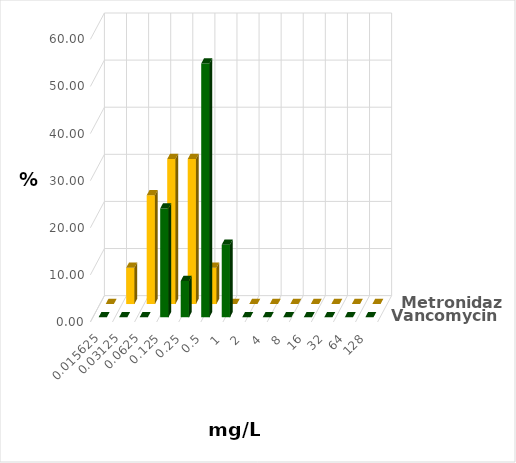
| Category | Vancomycin | Metronidazol |
|---|---|---|
| 0.015625 | 0 | 0 |
| 0.03125 | 0 | 7.692 |
| 0.0625 | 0 | 23.077 |
| 0.125 | 23.077 | 30.769 |
| 0.25 | 7.692 | 30.769 |
| 0.5 | 53.846 | 7.692 |
| 1.0 | 15.385 | 0 |
| 2.0 | 0 | 0 |
| 4.0 | 0 | 0 |
| 8.0 | 0 | 0 |
| 16.0 | 0 | 0 |
| 32.0 | 0 | 0 |
| 64.0 | 0 | 0 |
| 128.0 | 0 | 0 |